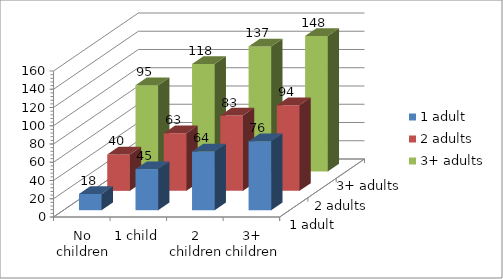
| Category | 1 adult | 2 adults | 3+ adults |
|---|---|---|---|
| No children | 17.888 | 39.859 | 94.51 |
| 1 child | 45.037 | 63.171 | 117.822 |
| 2 children | 64.372 | 82.506 | 137.157 |
| 3+ children | 75.637 | 93.771 | 148.422 |